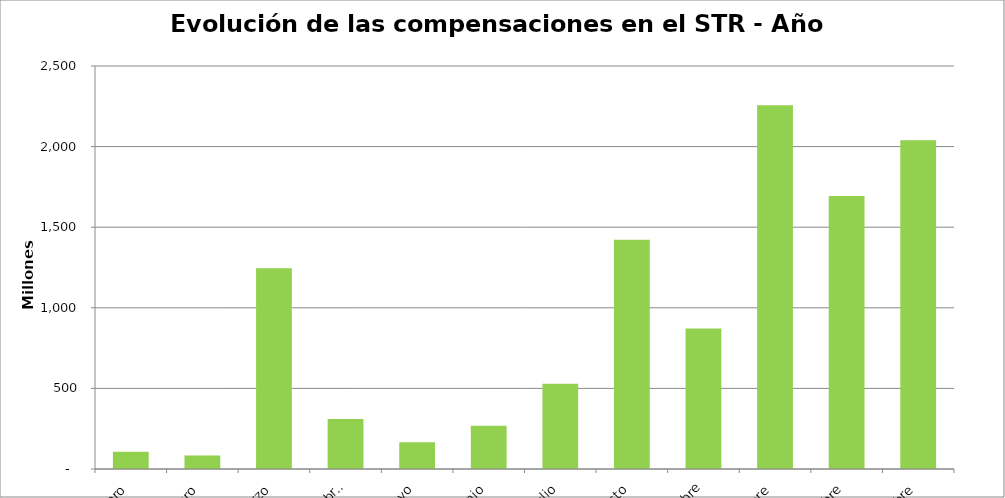
| Category | Enero |
|---|---|
| Enero | 107360287 |
| Febrero | 84232057 |
| Marzo | 1246106015.007 |
| Abril | 309453601.5 |
| Mayo | 165575506 |
| Junio | 267682065 |
| Julio | 529573365.668 |
| Agosto | 1422897632.86 |
| Septiembre | 871568082.99 |
| Octubre | 2256651889.461 |
| Noviembre | 1693213795.346 |
| Diciembre | 2039738966.072 |